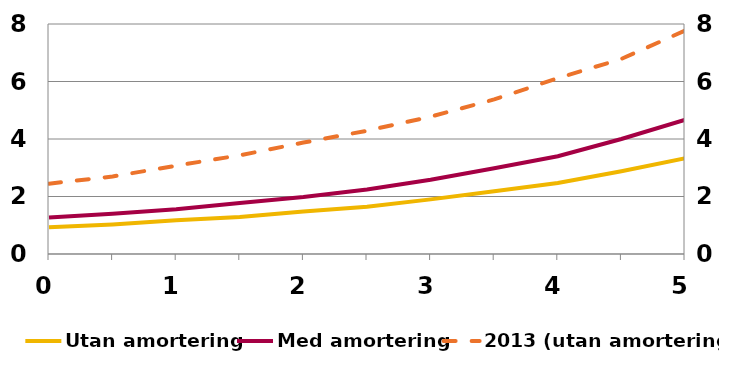
| Category | Utan amortering | tom |
|---|---|---|
| 0.0 | 0.93 |  |
| 0.5 | 1.03 |  |
| 1.0 | 1.17 |  |
| 1.5 | 1.29 |  |
| 2.0 | 1.48 |  |
| 2.5 | 1.64 |  |
| 3.0 | 1.9 |  |
| 3.5 | 2.18 |  |
| 4.0 | 2.47 |  |
| 4.5 | 2.88 |  |
| 5.0 | 3.33 |  |